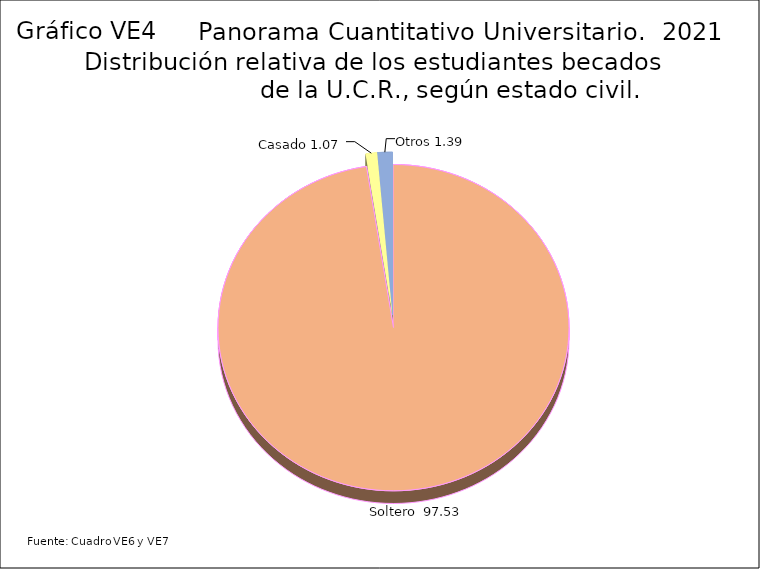
| Category | Series 3 |
|---|---|
| Soltero  | 97.53 |
| Casado | 1.07 |
| Otros | 1.39 |